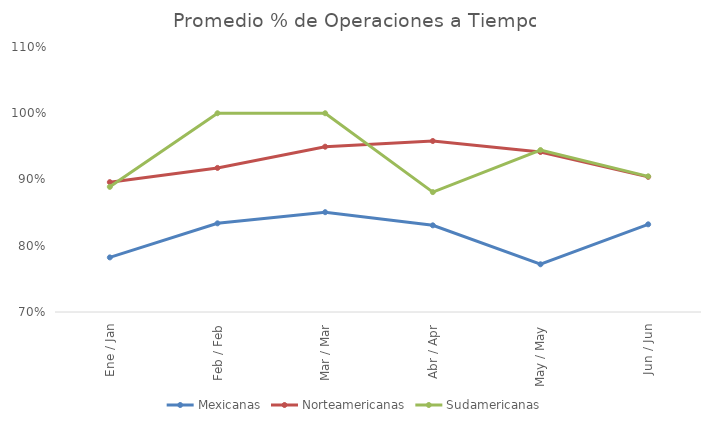
| Category | Mexicanas | Norteamericanas | Sudamericanas |
|---|---|---|---|
| Ene / Jan | 0.782 | 0.896 | 0.889 |
| Feb / Feb | 0.834 | 0.917 | 1 |
| Mar / Mar | 0.851 | 0.95 | 1 |
| Abr / Apr | 0.831 | 0.958 | 0.881 |
| May / May | 0.772 | 0.942 | 0.944 |
| Jun / Jun | 0.832 | 0.904 | 0.905 |